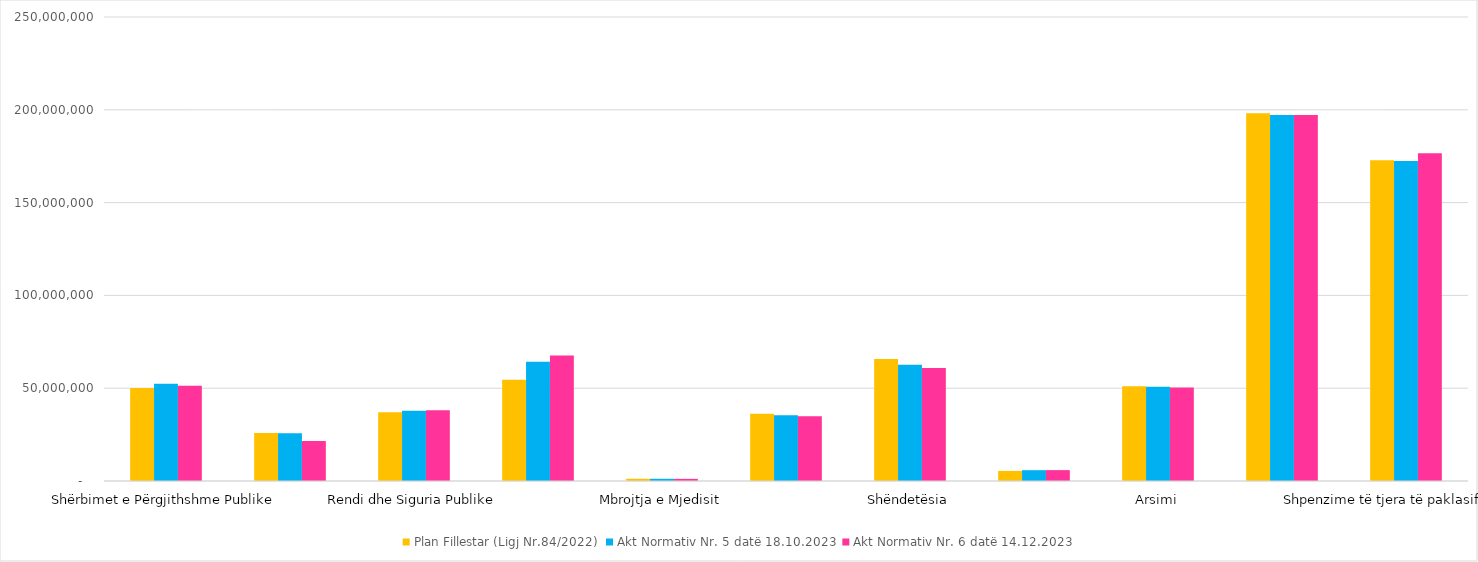
| Category | Plan Fillestar (Ligj Nr.84/2022) | Akt Normativ Nr. 5 datë 18.10.2023 | Akt Normativ Nr. 6 datë 14.12.2023 |
|---|---|---|---|
| Shërbimet e Përgjithshme Publike | 50081139 | 52366539.379 | 51381810 |
| Mbrojtja | 25920159 | 25687859 | 21610554 |
| Rendi dhe Siguria Publike | 37070174 | 37817960 | 38107350 |
| Çështjet Ekonomike | 54511407 | 64267807 | 67635937 |
| Mbrojtja e Mjedisit | 1202700 | 1200700 | 1156700 |
| Strehimi dhe Komoditetet e Komunitetit | 36189662 | 35369439 | 34835799 |
| Shëndetësia | 65728486 | 62668754.621 | 60833528 |
| Argëtimi, Kultura dhe Çështjet Fetare | 5432303 | 5823303 | 5864243 |
| Arsimi | 51048300 | 50776300 | 50399341 |
| Mbrojtja Sociale | 198175434 | 197215234 | 197188634 |
| Shpenzime të tjera të paklasifikuara | 172757104 | 172413104 | 176593104 |